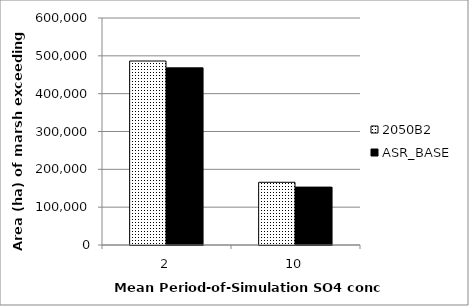
| Category | 2050B2 | ASR_BASE |
|---|---|---|
| 2.0 | 486325 | 468250 |
| 10.0 | 165775 | 153050 |